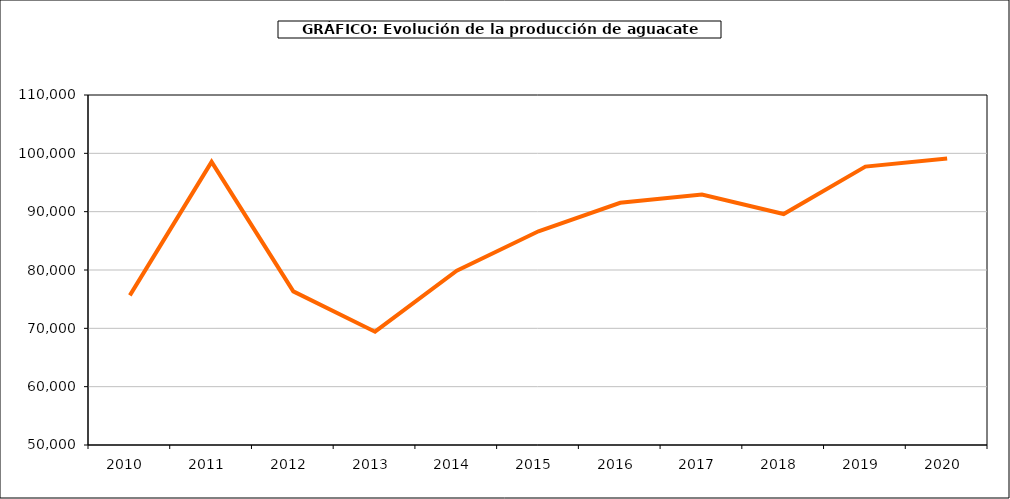
| Category | producción aguacate |
|---|---|
| 2010.0 | 75655 |
| 2011.0 | 98535 |
| 2012.0 | 76337 |
| 2013.0 | 69427 |
| 2014.0 | 79886 |
| 2015.0 | 86636 |
| 2016.0 | 91530 |
| 2017.0 | 92936 |
| 2018.0 | 89592 |
| 2019.0 | 97727 |
| 2020.0 | 99125 |